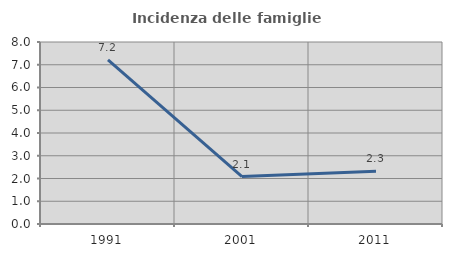
| Category | Incidenza delle famiglie numerose |
|---|---|
| 1991.0 | 7.219 |
| 2001.0 | 2.083 |
| 2011.0 | 2.321 |